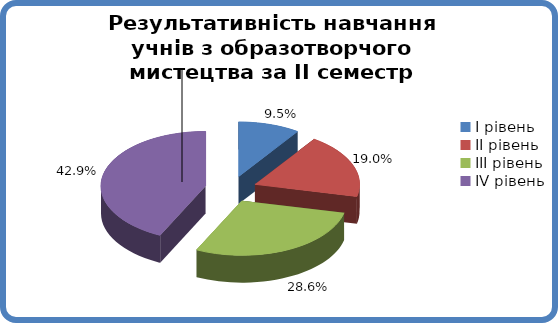
| Category | Series 0 |
|---|---|
| 0 | 0.095 |
| 1 | 0.19 |
| 2 | 0.286 |
| 3 | 0.429 |